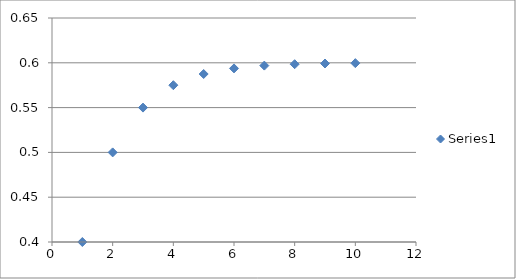
| Category | Series 0 |
|---|---|
| 1.0 | 0.4 |
| 2.0 | 0.5 |
| 3.0 | 0.55 |
| 4.0 | 0.575 |
| 5.0 | 0.587 |
| 6.0 | 0.594 |
| 7.0 | 0.597 |
| 8.0 | 0.598 |
| 9.0 | 0.599 |
| 10.0 | 0.6 |